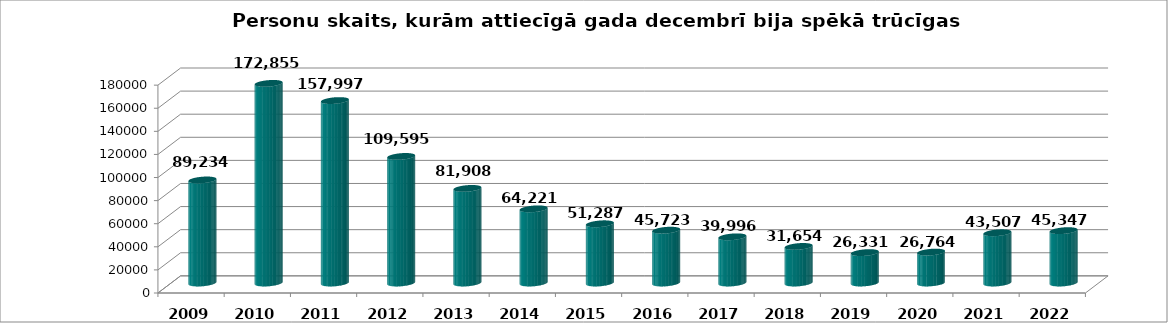
| Category | decembris |
|---|---|
| 2009.0 | 89234 |
| 2010.0 | 172855 |
| 2011.0 | 157997 |
| 2012.0 | 109595 |
| 2013.0 | 81908 |
| 2014.0 | 64221 |
| 2015.0 | 51287 |
| 2016.0 | 45723 |
| 2017.0 | 39996 |
| 2018.0 | 31654 |
| 2019.0 | 26331 |
| 2020.0 | 26764 |
| 2021.0 | 43507 |
| 2022.0 | 45347 |